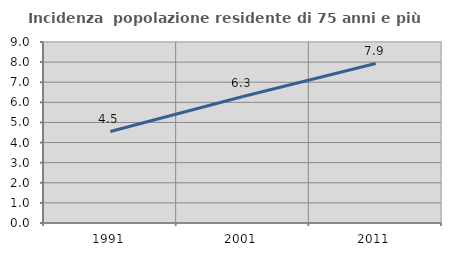
| Category | Incidenza  popolazione residente di 75 anni e più |
|---|---|
| 1991.0 | 4.548 |
| 2001.0 | 6.294 |
| 2011.0 | 7.928 |